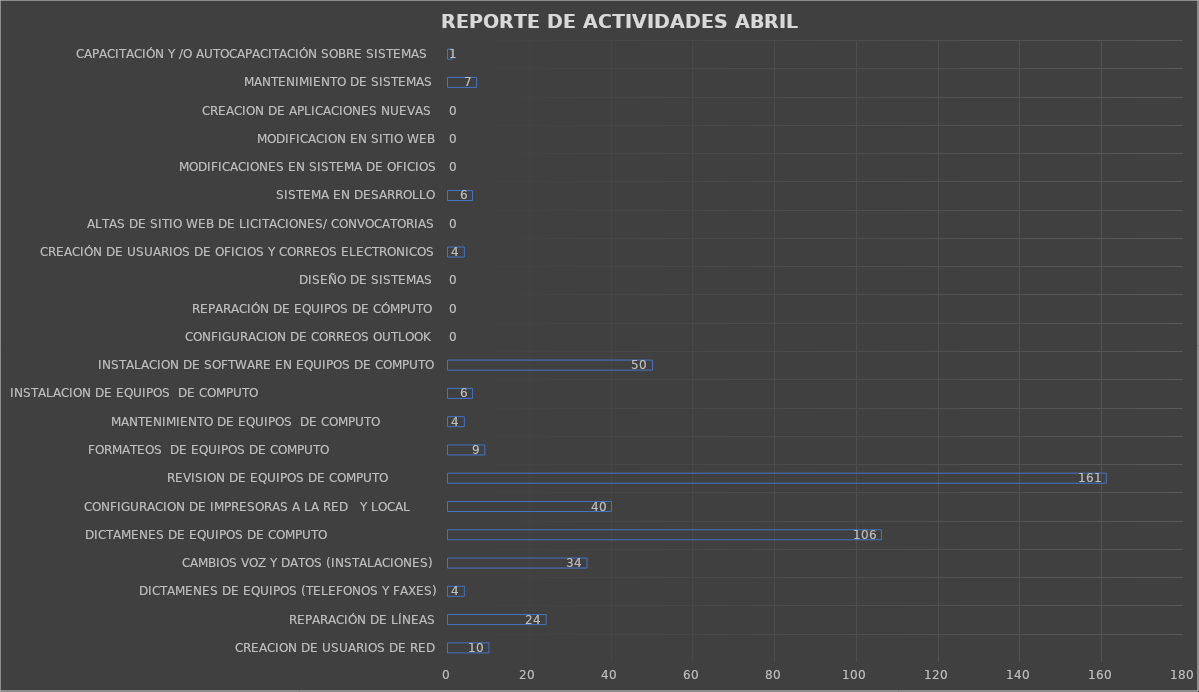
| Category | may-23 |
|---|---|
| CREACION DE USUARIOS DE RED | 10 |
| REPARACIÓN DE LÍNEAS | 24 |
| DICTAMENES DE EQUIPOS (TELEFONOS Y FAXES) | 4 |
| CAMBIOS VOZ Y DATOS (INSTALACIONES) | 34 |
| DICTAMENES DE EQUIPOS DE COMPUTO                             | 106 |
| CONFIGURACION DE IMPRESORAS A LA RED   Y LOCAL       | 40 |
| REVISION DE EQUIPOS DE COMPUTO             | 161 |
| FORMATEOS  DE EQUIPOS DE COMPUTO                            | 9 |
| MANTENIMIENTO DE EQUIPOS  DE COMPUTO               | 4 |
| INSTALACION DE EQUIPOS  DE COMPUTO                                               | 6 |
| INSTALACION DE SOFTWARE EN EQUIPOS DE COMPUTO | 50 |
| CONFIGURACION DE CORREOS OUTLOOK | 0 |
| REPARACIÓN DE EQUIPOS DE CÓMPUTO | 0 |
| DISEÑO DE SISTEMAS  | 0 |
| CREACIÓN DE USUARIOS DE OFICIOS Y CORREOS ELECTRONICOS | 4 |
| ALTAS DE SITIO WEB DE LICITACIONES/ CONVOCATORIAS | 0 |
| SISTEMA EN DESARROLLO | 6 |
| MODIFICACIONES EN SISTEMA DE OFICIOS | 0 |
| MODIFICACION EN SITIO WEB | 0 |
| CREACION DE APLICACIONES NUEVAS  | 0 |
| MANTENIMIENTO DE SISTEMAS  | 7 |
| CAPACITACIÓN Y /O AUTOCAPACITACIÓN SOBRE SISTEMAS  | 1 |